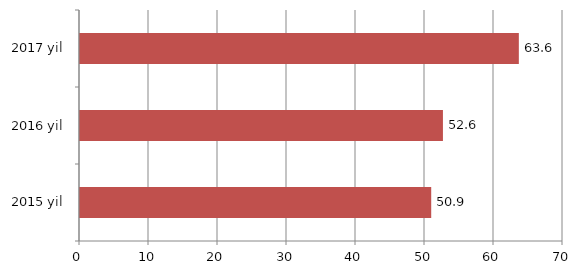
| Category | Series 0 |
|---|---|
| 2015 yil | 50.9 |
| 2016 yil | 52.6 |
| 2017 yil | 63.6 |